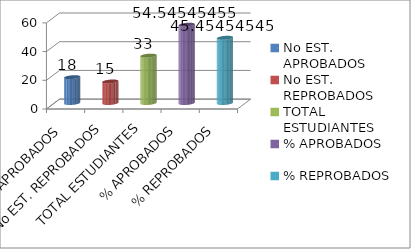
| Category | Series 0 |
|---|---|
| No EST. APROBADOS | 18 |
| No EST. REPROBADOS | 15 |
| TOTAL ESTUDIANTES | 33 |
| % APROBADOS | 54.545 |
| % REPROBADOS | 45.455 |